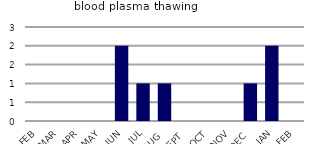
| Category | blood plasma thawing |
|---|---|
| FEB | 0 |
| MAR | 0 |
| APR | 0 |
| MAY | 0 |
| JUN | 2 |
| JUL | 1 |
| AUG | 1 |
| SEPT | 0 |
| OCT | 0 |
| NOV | 0 |
| DEC | 1 |
| JAN | 2 |
| FEB | 0 |